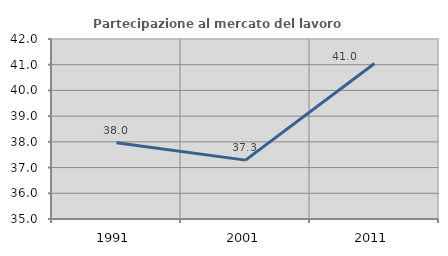
| Category | Partecipazione al mercato del lavoro  femminile |
|---|---|
| 1991.0 | 37.964 |
| 2001.0 | 37.29 |
| 2011.0 | 41.047 |